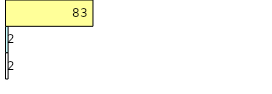
| Category | Total Standouts | Total Recd | Total Tipsters |
|---|---|---|---|
| 0 | 2 | 2 | 83 |